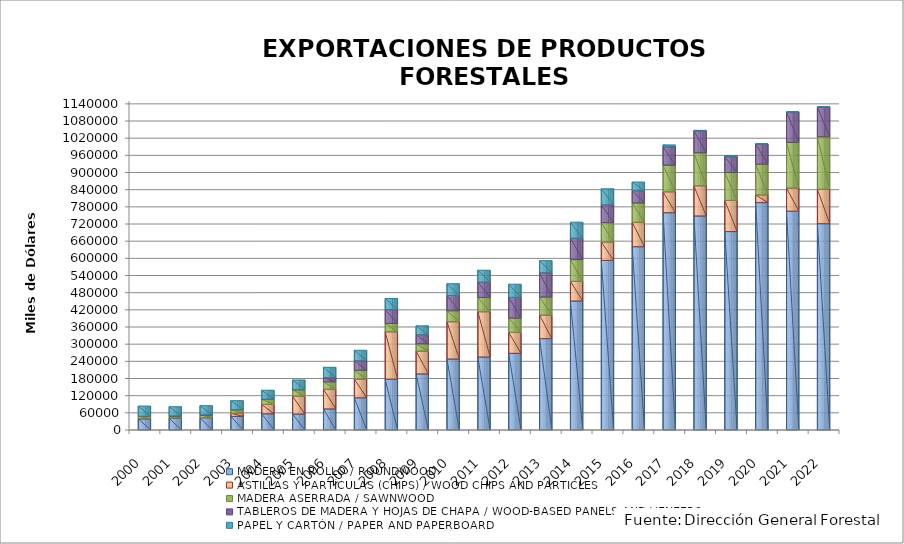
| Category | MADERA EN ROLLO / ROUNDWOOD | ASTILLAS Y PARTÍCULAS (CHIPS) / WOOD CHIPS AND PARTICLES | MADERA ASERRADA / SAWNWOOD | TABLEROS DE MADERA Y HOJAS DE CHAPA / WOOD-BASED PANELS AND VENEERS | PAPEL Y CARTÓN / PAPER AND PAPERBOARD |
|---|---|---|---|---|---|
| 2000.0 | 39388 | 426 | 7793 | 0 | 36169 |
| 2001.0 | 40853 | 667 | 7011 | 0 | 32918 |
| 2002.0 | 42982 | 667 | 8759 | 9 | 32634 |
| 2003.0 | 47523 | 10865 | 12793 | 4 | 31419 |
| 2004.0 | 56534 | 32694 | 18137 | 10 | 31617 |
| 2005.0 | 55735 | 62286 | 22734 | 559 | 33654 |
| 2006.0 | 73635 | 69015 | 25579 | 14623 | 36415 |
| 2007.0 | 112511 | 65394 | 30648 | 33610 | 36451 |
| 2008.0 | 177363 | 165848 | 29446 | 47563 | 39643 |
| 2009.0 | 196005 | 79696 | 25450 | 31895 | 30972 |
| 2010.0 | 248025 | 130234 | 38500 | 53490 | 41115 |
| 2011.0 | 255110 | 158239 | 49912 | 53493 | 41715 |
| 2012.0 | 267964.76 | 73302 | 49849.714 | 72462.709 | 46110.602 |
| 2013.0 | 319262.456 | 82060 | 63406.496 | 84892.809 | 42274.253 |
| 2014.0 | 450753.038 | 68707 | 76173 | 74476.2 | 56240.305 |
| 2015.0 | 592769.293 | 64376.165 | 67526.12 | 62565.051 | 55737.234 |
| 2016.0 | 640732.51 | 85270.806 | 67450.715 | 43013.766 | 30296.831 |
| 2017.0 | 759543.043 | 73020.814 | 93031 | 63676.239 | 7160.416 |
| 2018.0 | 748082.674 | 105377.864 | 115454.609 | 76312.838 | 2158.598 |
| 2019.0 | 693620.553 | 108958.81 | 97337.11 | 55497.84 | 4042.796 |
| 2020.0 | 794882.629 | 26887.545 | 107266.825 | 70518.902 | 581.329 |
| 2021.0 | 764909.531 | 80839.982 | 159748.595 | 106035.668 | 449.321 |
| 2022.0 | 721176.684 | 120169.682 | 183572.585 | 104103.177 | 467.297 |